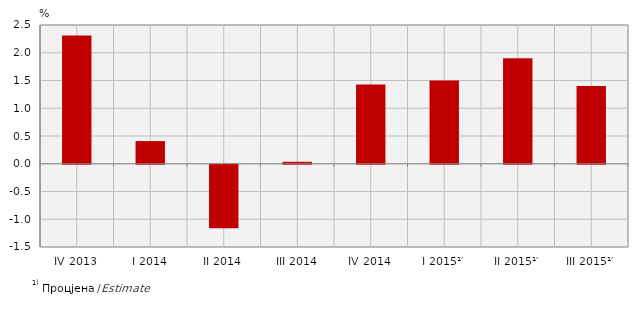
| Category | Стопе реалног раста БДП-а
Real growth rates of GDP |
|---|---|
| IV 2013 | 2.31 |
| I 2014 | 0.408 |
| II 2014 | -1.145 |
| III 2014 | 0.035 |
| IV 2014 | 1.43 |
| I 2015¹′ | 1.5 |
| II 2015¹′ | 1.9 |
| III 2015¹′ | 1.4 |